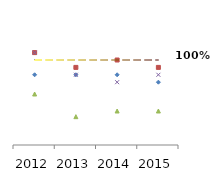
| Category | ACC Ltd Power & Fuel | Ambuja Cement Power & Fuel | JK Lakshmi Cement Power & Fuel | Ultratech Cement Power & Fuel | Baseline |
|---|---|---|---|---|---|
| 2012.0 | 0.913 | 1.043 | 0.8 | 1.043 | 1 |
| 2013.0 | 0.913 | 0.957 | 0.667 | 0.913 | 1 |
| 2014.0 | 0.913 | 1 | 0.7 | 0.87 | 1 |
| 2015.0 | 0.87 | 0.957 | 0.7 | 0.913 | 1 |